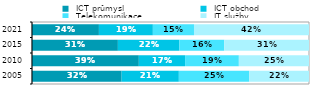
| Category |  ICT průmysl |  ICT obchod |  Telekomunikace |  IT služby  |
|---|---|---|---|---|
| 2005.0 | 0.324 | 0.207 | 0.254 | 0.216 |
| 2010.0 | 0.386 | 0.167 | 0.194 | 0.253 |
| 2015.0 | 0.31 | 0.222 | 0.162 | 0.306 |
| 2021.0 | 0.242 | 0.195 | 0.148 | 0.415 |